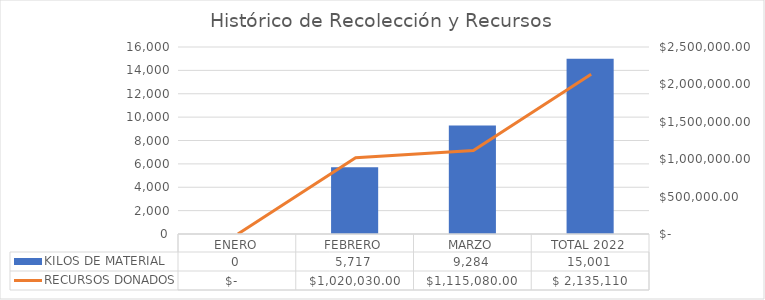
| Category | KILOS DE MATERIAL |
|---|---|
| ENERO | 0 |
| FEBRERO | 5717 |
| MARZO | 9283.5 |
| TOTAL 2022 | 15000.5 |